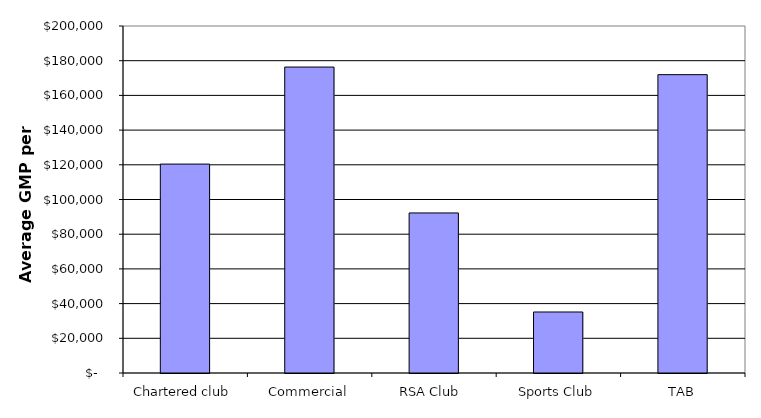
| Category | Series 0 |
|---|---|
| Chartered club | 120411.862 |
| Commercial | 176341.392 |
| RSA Club  | 92253.641 |
| Sports Club | 35164.71 |
| TAB | 171961.716 |